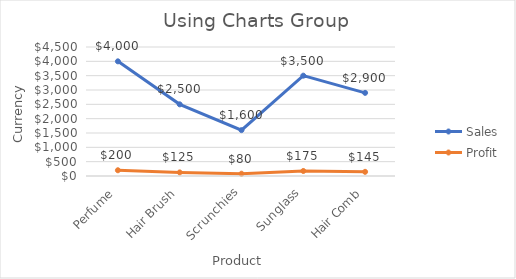
| Category | Sales | Profit |
|---|---|---|
| Perfume | 4000 | 200 |
| Hair Brush | 2500 | 125 |
| Scrunchies | 1600 | 80 |
| Sunglass | 3500 | 175 |
| Hair Comb | 2900 | 145 |